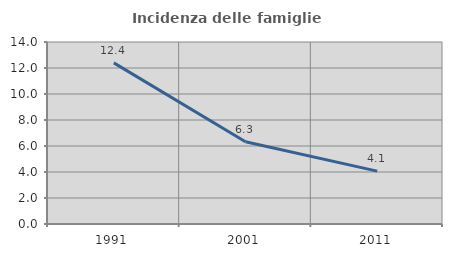
| Category | Incidenza delle famiglie numerose |
|---|---|
| 1991.0 | 12.393 |
| 2001.0 | 6.322 |
| 2011.0 | 4.07 |